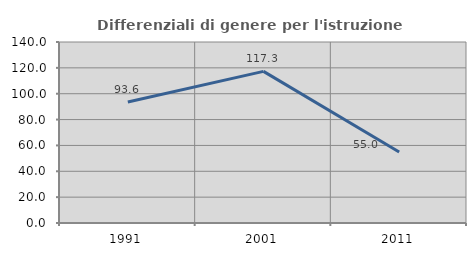
| Category | Differenziali di genere per l'istruzione superiore |
|---|---|
| 1991.0 | 93.617 |
| 2001.0 | 117.293 |
| 2011.0 | 54.974 |